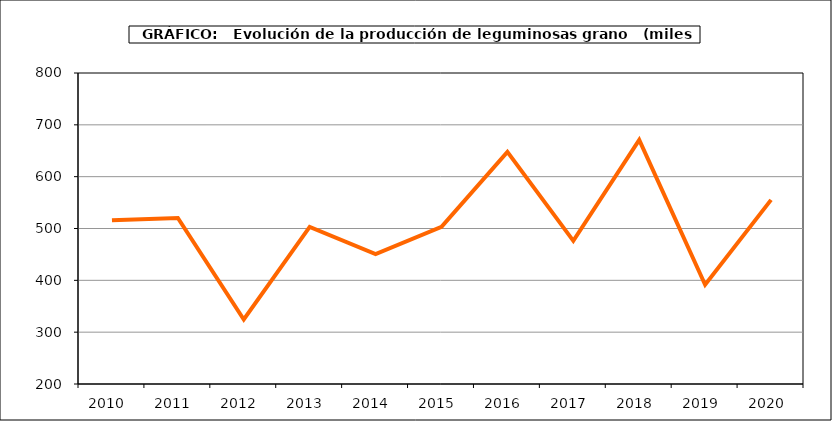
| Category | Producción |
|---|---|
| 2010.0 | 515.802 |
| 2011.0 | 520.288 |
| 2012.0 | 324.471 |
| 2013.0 | 503.069 |
| 2014.0 | 450.507 |
| 2015.0 | 503.331 |
| 2016.0 | 647.72 |
| 2017.0 | 476.139 |
| 2018.0 | 670.719 |
| 2019.0 | 391.483 |
| 2020.0 | 555.232 |